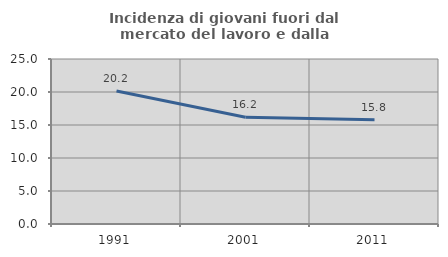
| Category | Incidenza di giovani fuori dal mercato del lavoro e dalla formazione  |
|---|---|
| 1991.0 | 20.162 |
| 2001.0 | 16.165 |
| 2011.0 | 15.792 |